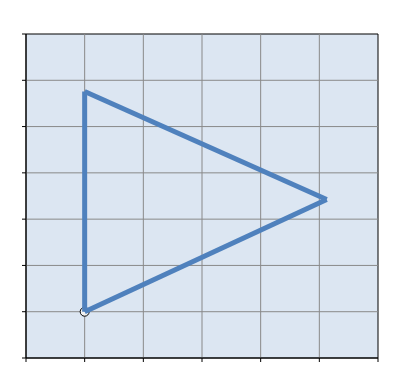
| Category | 1 |
|---|---|
| 100000000.0 | 100000000 |
| 100000020.62755586 | 100000012.121 |
| 99999999.99953134 | 100000023.781 |
| 99999999.99999999 | 100000000 |
| 99999999.99999999 | 100000000 |
| 99999999.99999999 | 100000000 |
| 99999999.99999999 | 100000000 |
| 99999999.99999999 | 100000000 |
| 99999999.99999999 | 100000000 |
| 99999999.99999999 | 100000000 |
| 99999999.99999999 | 100000000 |
| 99999999.99999999 | 100000000 |
| 99999999.99999999 | 100000000 |
| 99999999.99999999 | 100000000 |
| 99999999.99999999 | 100000000 |
| 99999999.99999999 | 100000000 |
| 99999999.99999999 | 100000000 |
| 99999999.99999999 | 100000000 |
| 99999999.99999999 | 100000000 |
| 99999999.99999999 | 100000000 |
| 99999999.99999999 | 100000000 |
| 99999999.99999999 | 100000000 |
| 99999999.99999999 | 100000000 |
| 99999999.99999999 | 100000000 |
| 99999999.99999999 | 100000000 |
| 99999999.99999999 | 100000000 |
| 99999999.99999999 | 100000000 |
| 99999999.99999999 | 100000000 |
| 99999999.99999999 | 100000000 |
| 99999999.99999999 | 100000000 |
| 99999999.99999999 | 100000000 |
| 99999999.99999999 | 100000000 |
| 99999999.99999999 | 100000000 |
| 99999999.99999999 | 100000000 |
| 99999999.99999999 | 100000000 |
| 99999999.99999999 | 100000000 |
| 99999999.99999999 | 100000000 |
| 99999999.99999999 | 100000000 |
| 99999999.99999999 | 100000000 |
| 99999999.99999999 | 100000000 |
| 99999999.99999999 | 100000000 |
| 99999999.99999999 | 100000000 |
| 99999999.99999999 | 100000000 |
| 99999999.99999999 | 100000000 |
| 99999999.99999999 | 100000000 |
| 99999999.99999999 | 100000000 |
| 99999999.99999999 | 100000000 |
| 99999999.99999999 | 100000000 |
| 99999999.99999999 | 100000000 |
| 99999999.99999999 | 100000000 |
| 99999999.99999999 | 100000000 |
| 99999999.99999999 | 100000000 |
| 99999999.99999999 | 100000000 |
| 99999999.99999999 | 100000000 |
| 99999999.99999999 | 100000000 |
| 99999999.99999999 | 100000000 |
| 99999999.99999999 | 100000000 |
| 99999999.99999999 | 100000000 |
| 99999999.99999999 | 100000000 |
| 99999999.99999999 | 100000000 |
| 99999999.99999999 | 100000000 |
| 99999999.99999999 | 100000000 |
| 99999999.99999999 | 100000000 |
| 99999999.99999999 | 100000000 |
| 99999999.99999999 | 100000000 |
| 99999999.99999999 | 100000000 |
| 99999999.99999999 | 100000000 |
| 99999999.99999999 | 100000000 |
| 99999999.99999999 | 100000000 |
| 99999999.99999999 | 100000000 |
| 99999999.99999999 | 100000000 |
| 99999999.99999999 | 100000000 |
| 99999999.99999999 | 100000000 |
| 99999999.99999999 | 100000000 |
| 99999999.99999999 | 100000000 |
| 99999999.99999999 | 100000000 |
| 99999999.99999999 | 100000000 |
| 99999999.99999999 | 100000000 |
| 99999999.99999999 | 100000000 |
| 99999999.99999999 | 100000000 |
| 99999999.99999999 | 100000000 |
| 99999999.99999999 | 100000000 |
| 99999999.99999999 | 100000000 |
| 99999999.99999999 | 100000000 |
| 99999999.99999999 | 100000000 |
| 99999999.99999999 | 100000000 |
| 99999999.99999999 | 100000000 |
| 99999999.99999999 | 100000000 |
| 99999999.99999999 | 100000000 |
| 99999999.99999999 | 100000000 |
| 99999999.99999999 | 100000000 |
| 99999999.99999999 | 100000000 |
| 99999999.99999999 | 100000000 |
| 99999999.99999999 | 100000000 |
| 99999999.99999999 | 100000000 |
| 99999999.99999999 | 100000000 |
| 99999999.99999999 | 100000000 |
| 99999999.99999999 | 100000000 |
| 99999999.99999999 | 100000000 |
| 99999999.99999999 | 100000000 |
| 99999999.99999999 | 100000000 |